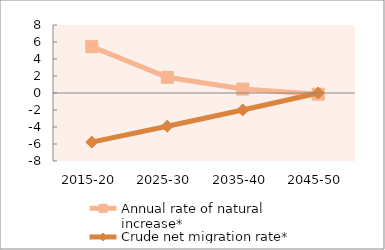
| Category | Annual rate of natural increase* | Crude net migration rate* |
|---|---|---|
| 2015-20 | 5.449 | -5.78 |
| 2025-30 | 1.842 | -3.905 |
| 2035-40 | 0.465 | -1.994 |
| 2045-50 | -0.141 | 0 |